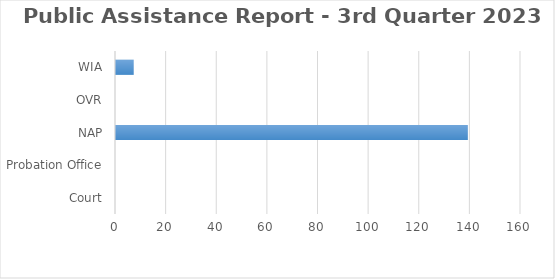
| Category | Series 0 |
|---|---|
| Court | 0 |
| Probation Office | 0 |
| NAP | 139 |
| OVR | 0 |
| WIA | 7 |